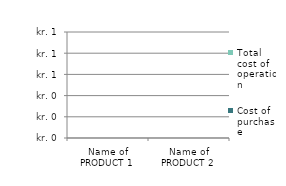
| Category | Cost of purchase | Total cost of operation |
|---|---|---|
| Name of PRODUCT 1 | 0 | 0 |
| Name of PRODUCT 2 | 0 | 0 |